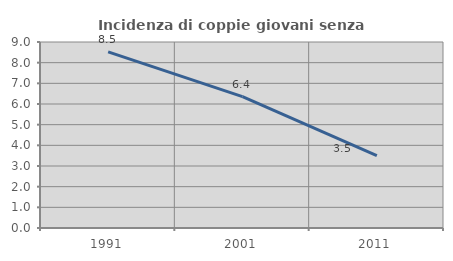
| Category | Incidenza di coppie giovani senza figli |
|---|---|
| 1991.0 | 8.523 |
| 2001.0 | 6.36 |
| 2011.0 | 3.497 |